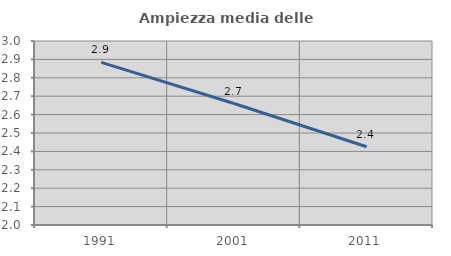
| Category | Ampiezza media delle famiglie |
|---|---|
| 1991.0 | 2.884 |
| 2001.0 | 2.66 |
| 2011.0 | 2.425 |